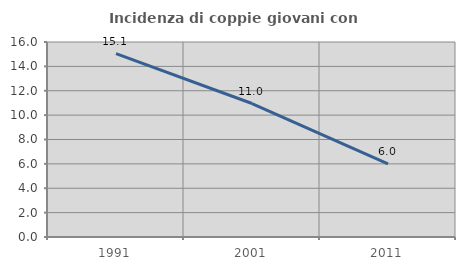
| Category | Incidenza di coppie giovani con figli |
|---|---|
| 1991.0 | 15.052 |
| 2001.0 | 10.953 |
| 2011.0 | 5.996 |